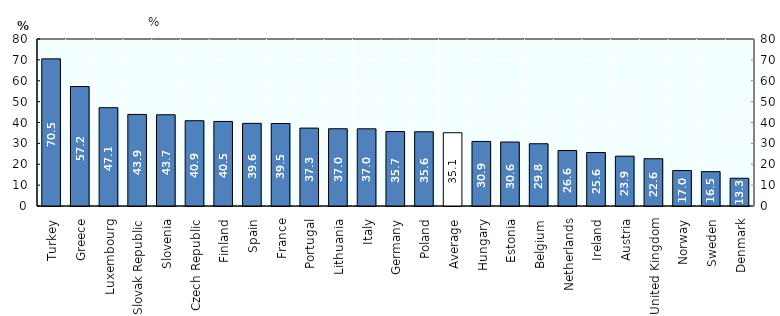
| Category | Job Strain (%) |
|---|---|
| Turkey  | 70.481 |
| Greece  | 57.222 |
| Luxembourg  | 47.089 |
| Slovak Republic  | 43.859 |
| Slovenia  | 43.72 |
| Czech Republic  | 40.86 |
| Finland  | 40.507 |
| Spain  | 39.59 |
| France  | 39.522 |
| Portugal  | 37.318 |
| Lithuania  | 37 |
| Italy  | 36.979 |
| Germany  | 35.663 |
| Poland  | 35.564 |
| Average  | 35.092 |
| Hungary  | 30.923 |
| Estonia  | 30.644 |
| Belgium  | 29.822 |
| Netherlands  | 26.579 |
| Ireland  | 25.609 |
| Austria  | 23.865 |
| United Kingdom  | 22.649 |
| Norway  | 16.984 |
| Sweden  | 16.458 |
| Denmark  | 13.292 |